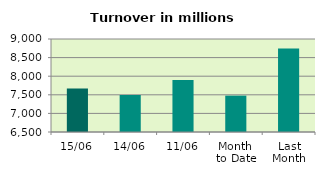
| Category | Series 0 |
|---|---|
| 15/06 | 7666.944 |
| 14/06 | 7495.133 |
| 11/06 | 7897.156 |
| Month 
to Date | 7477.516 |
| Last
Month | 8745.898 |